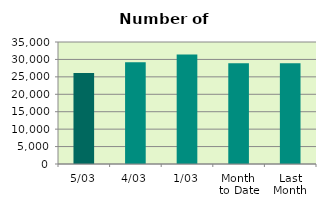
| Category | Series 0 |
|---|---|
| 5/03 | 26118 |
| 4/03 | 29208 |
| 1/03 | 31442 |
| Month 
to Date | 28922.667 |
| Last
Month | 28915.6 |